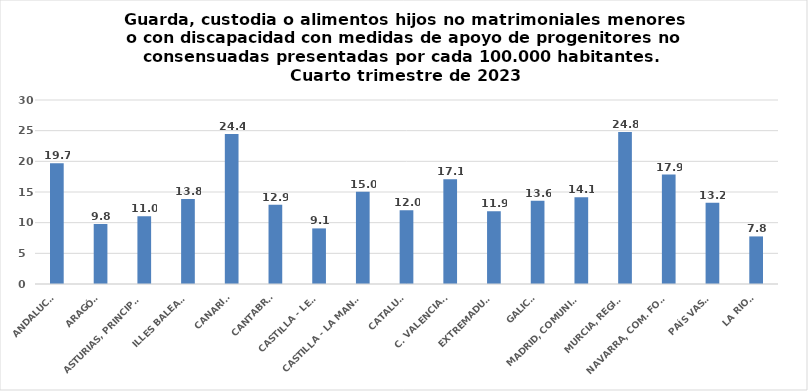
| Category | Series 0 |
|---|---|
| ANDALUCÍA | 19.668 |
| ARAGÓN | 9.783 |
| ASTURIAS, PRINCIPADO | 11.027 |
| ILLES BALEARS | 13.839 |
| CANARIAS | 24.448 |
| CANTABRIA | 12.914 |
| CASTILLA - LEÓN | 9.066 |
| CASTILLA - LA MANCHA | 15.044 |
| CATALUÑA | 12.039 |
| C. VALENCIANA | 17.075 |
| EXTREMADURA | 11.856 |
| GALICIA | 13.557 |
| MADRID, COMUNIDAD | 14.134 |
| MURCIA, REGIÓN | 24.796 |
| NAVARRA, COM. FORAL | 17.852 |
| PAÍS VASCO | 13.244 |
| LA RIOJA | 7.758 |